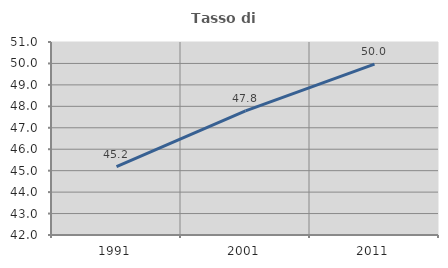
| Category | Tasso di occupazione   |
|---|---|
| 1991.0 | 45.187 |
| 2001.0 | 47.787 |
| 2011.0 | 49.97 |